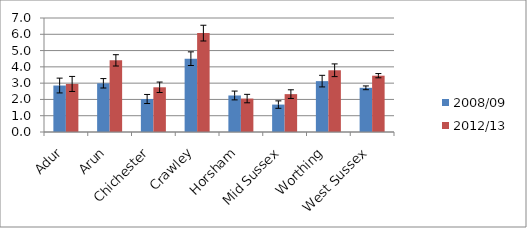
| Category | 2008/09 | 2012/13 |
|---|---|---|
| Adur | 2.853 | 2.951 |
| Arun | 2.99 | 4.399 |
| Chichester | 2.026 | 2.746 |
| Crawley | 4.502 | 6.072 |
| Horsham | 2.243 | 2.053 |
| Mid Sussex | 1.683 | 2.325 |
| Worthing | 3.124 | 3.791 |
| West Sussex | 2.713 | 3.458 |